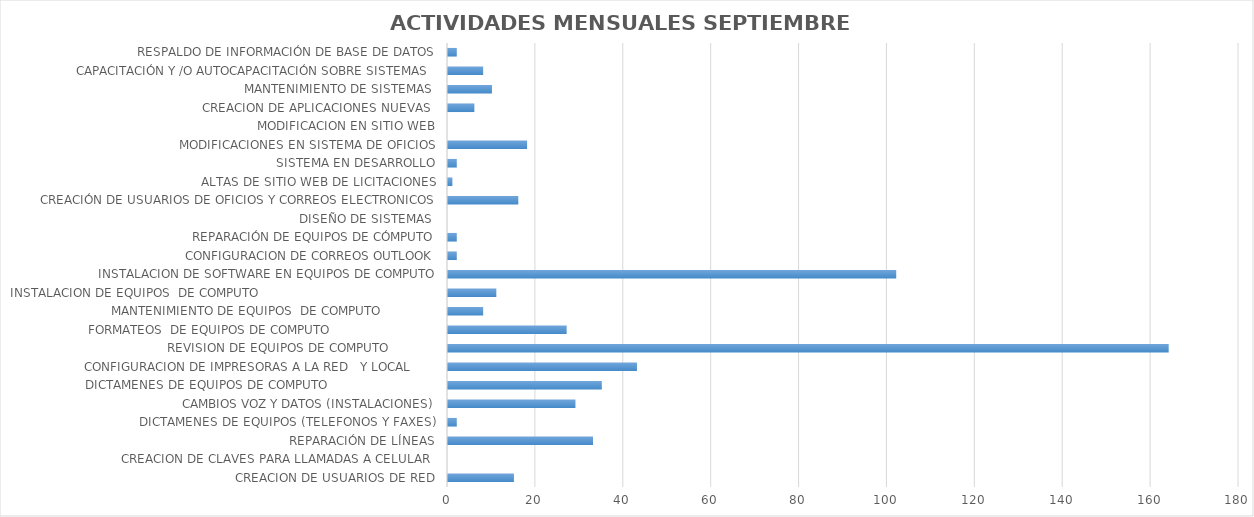
| Category | Series 0 |
|---|---|
| CREACION DE USUARIOS DE RED | 15 |
| CREACION DE CLAVES PARA LLAMADAS A CELULAR  | 0 |
| REPARACIÓN DE LÍNEAS | 33 |
| DICTAMENES DE EQUIPOS (TELEFONOS Y FAXES) | 2 |
| CAMBIOS VOZ Y DATOS (INSTALACIONES) | 29 |
| DICTAMENES DE EQUIPOS DE COMPUTO                             | 35 |
| CONFIGURACION DE IMPRESORAS A LA RED   Y LOCAL       | 43 |
| REVISION DE EQUIPOS DE COMPUTO             | 164 |
| FORMATEOS  DE EQUIPOS DE COMPUTO                            | 27 |
| MANTENIMIENTO DE EQUIPOS  DE COMPUTO               | 8 |
| INSTALACION DE EQUIPOS  DE COMPUTO                                               | 11 |
| INSTALACION DE SOFTWARE EN EQUIPOS DE COMPUTO | 102 |
| CONFIGURACION DE CORREOS OUTLOOK | 2 |
| REPARACIÓN DE EQUIPOS DE CÓMPUTO | 2 |
| DISEÑO DE SISTEMAS  | 0 |
| CREACIÓN DE USUARIOS DE OFICIOS Y CORREOS ELECTRONICOS | 16 |
| ALTAS DE SITIO WEB DE LICITACIONES | 1 |
| SISTEMA EN DESARROLLO | 2 |
| MODIFICACIONES EN SISTEMA DE OFICIOS | 18 |
| MODIFICACION EN SITIO WEB | 0 |
| CREACION DE APLICACIONES NUEVAS  | 6 |
| MANTENIMIENTO DE SISTEMAS  | 10 |
| CAPACITACIÓN Y /O AUTOCAPACITACIÓN SOBRE SISTEMAS  | 8 |
| RESPALDO DE INFORMACIÓN DE BASE DE DATOS | 2 |